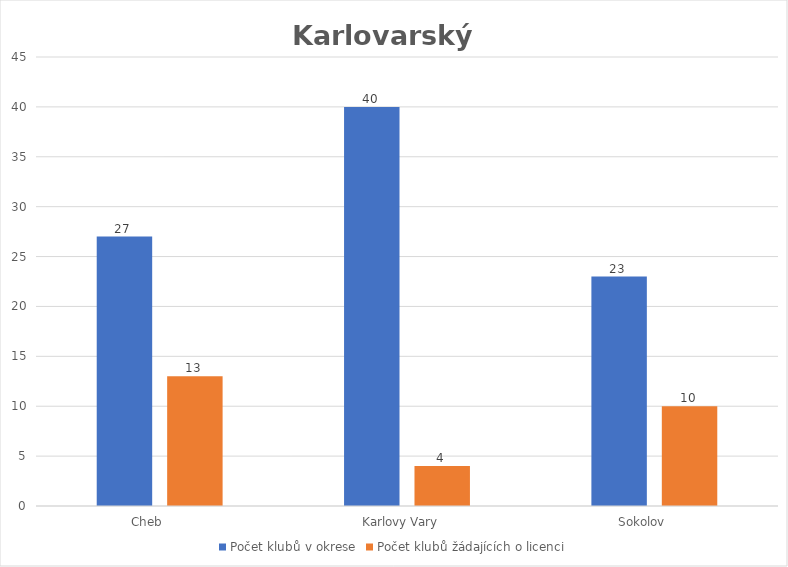
| Category | Počet klubů v okrese | Počet klubů žádajících o licenci |
|---|---|---|
| Cheb       | 27 | 13 |
| Karlovy Vary   | 40 | 4 |
| Sokolov       | 23 | 10 |